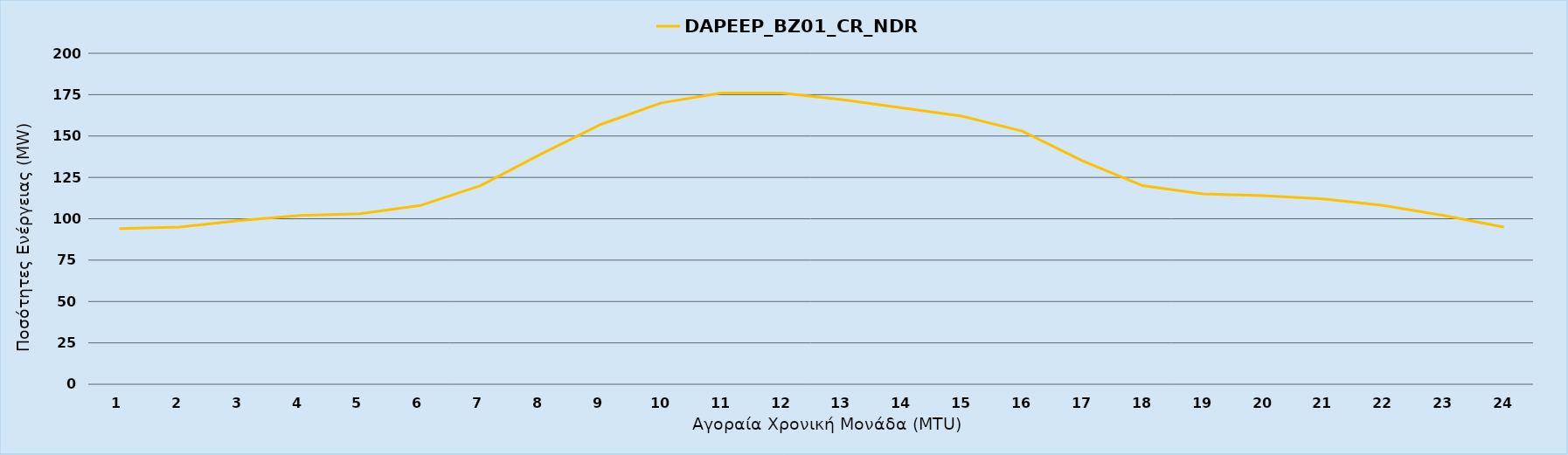
| Category | DAPEEP_BZ01_CR_NDR |
|---|---|
| 0 | 94 |
| 1 | 95 |
| 2 | 99 |
| 3 | 102 |
| 4 | 103 |
| 5 | 108 |
| 6 | 120 |
| 7 | 139 |
| 8 | 157 |
| 9 | 170 |
| 10 | 176 |
| 11 | 176 |
| 12 | 172 |
| 13 | 167 |
| 14 | 162 |
| 15 | 153 |
| 16 | 135 |
| 17 | 120 |
| 18 | 115 |
| 19 | 114 |
| 20 | 112 |
| 21 | 108 |
| 22 | 102 |
| 23 | 95 |